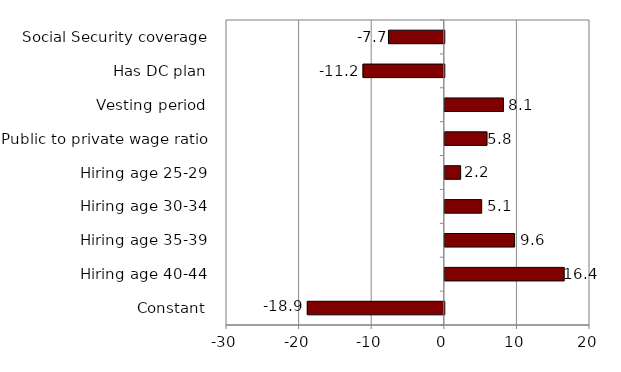
| Category | Series 0 |
|---|---|
| Constant | -18.867 |
| Hiring age 40-44 | 16.449 |
| Hiring age 35-39 | 9.612 |
| Hiring age 30-34 | 5.082 |
| Hiring age 25-29 | 2.185 |
| Public to private wage ratio | 5.82 |
| Vesting period | 8.078 |
| Has DC plan | -11.195 |
| Social Security coverage | -7.689 |